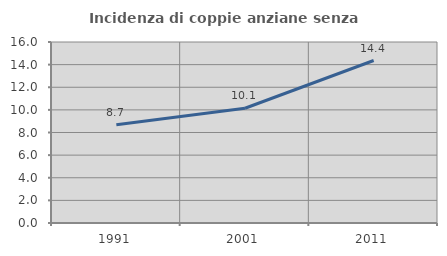
| Category | Incidenza di coppie anziane senza figli  |
|---|---|
| 1991.0 | 8.679 |
| 2001.0 | 10.142 |
| 2011.0 | 14.365 |